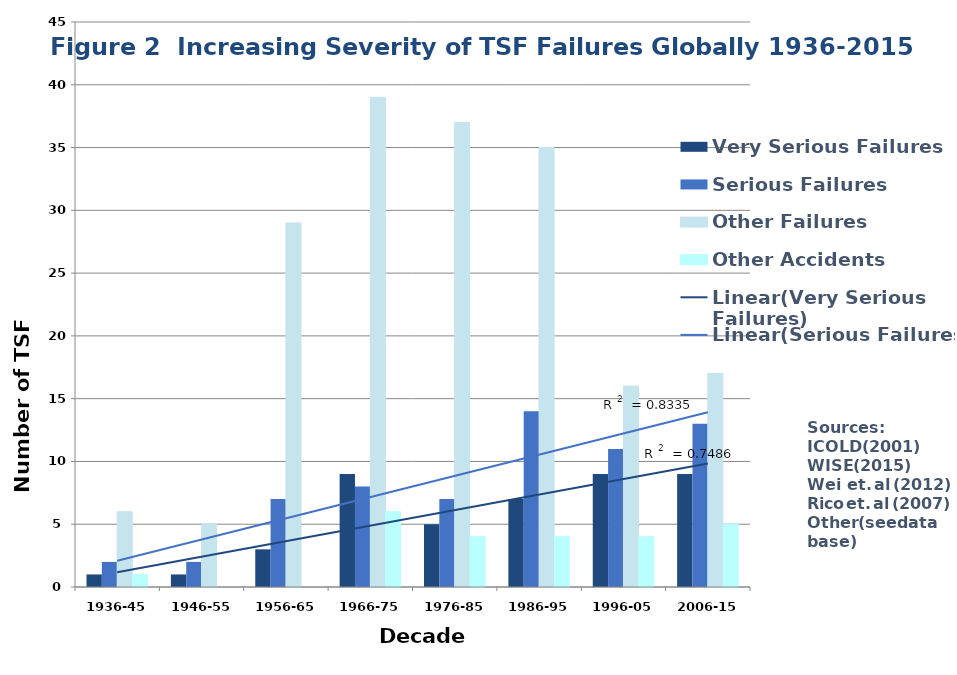
| Category | Very Serious Failures | Serious Failures | Other Failures | Other Accidents |
|---|---|---|---|---|
| 1936-45 | 1 | 2 | 6 | 1 |
| 1946-55 | 1 | 2 | 5 | 0 |
| 1956-65 | 3 | 7 | 29 | 0 |
| 1966-75 | 9 | 8 | 39 | 6 |
| 1976-85 | 5 | 7 | 37 | 4 |
| 1986-95 | 7 | 14 | 35 | 4 |
| 1996-05 | 9 | 11 | 16 | 4 |
| 2006-15 | 9 | 13 | 17 | 5 |